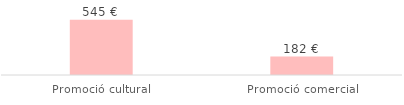
| Category | Total |
|---|---|
| Promoció cultural | 544.5 |
| Promoció comercial | 181.5 |